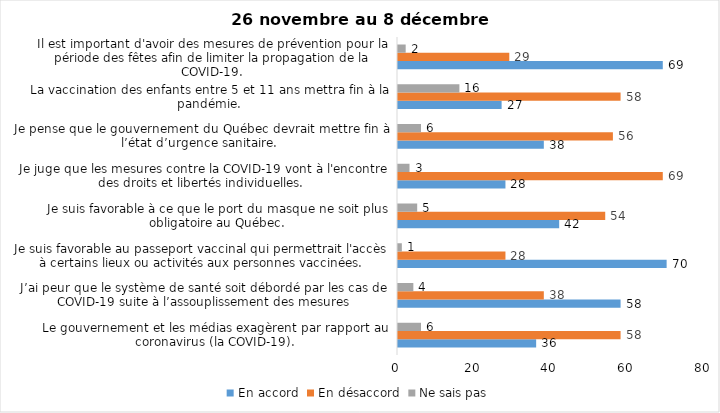
| Category | En accord | En désaccord | Ne sais pas |
|---|---|---|---|
| Le gouvernement et les médias exagèrent par rapport au coronavirus (la COVID-19). | 36 | 58 | 6 |
| J’ai peur que le système de santé soit débordé par les cas de COVID-19 suite à l’assouplissement des mesures | 58 | 38 | 4 |
| Je suis favorable au passeport vaccinal qui permettrait l'accès à certains lieux ou activités aux personnes vaccinées. | 70 | 28 | 1 |
| Je suis favorable à ce que le port du masque ne soit plus obligatoire au Québec. | 42 | 54 | 5 |
| Je juge que les mesures contre la COVID-19 vont à l'encontre des droits et libertés individuelles.  | 28 | 69 | 3 |
| Je pense que le gouvernement du Québec devrait mettre fin à l’état d’urgence sanitaire.  | 38 | 56 | 6 |
| La vaccination des enfants entre 5 et 11 ans mettra fin à la pandémie. | 27 | 58 | 16 |
| Il est important d'avoir des mesures de prévention pour la période des fêtes afin de limiter la propagation de la COVID-19. | 69 | 29 | 2 |